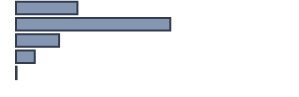
| Category | Series 0 |
|---|---|
| 0 | 22.1 |
| 1 | 55.5 |
| 2 | 15.5 |
| 3 | 6.7 |
| 4 | 0.2 |